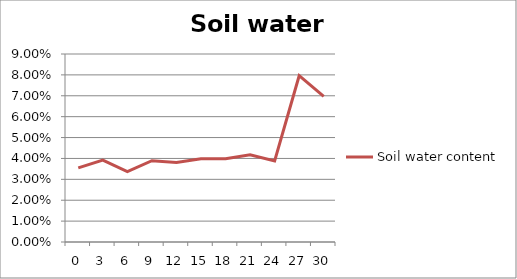
| Category | Soil water content |
|---|---|
| 0.0 | 0.036 |
| 3.0 | 0.039 |
| 6.0 | 0.034 |
| 9.0 | 0.039 |
| 12.0 | 0.038 |
| 15.0 | 0.04 |
| 18.0 | 0.04 |
| 21.0 | 0.042 |
| 24.0 | 0.039 |
| 27.0 | 0.08 |
| 30.0 | 0.07 |